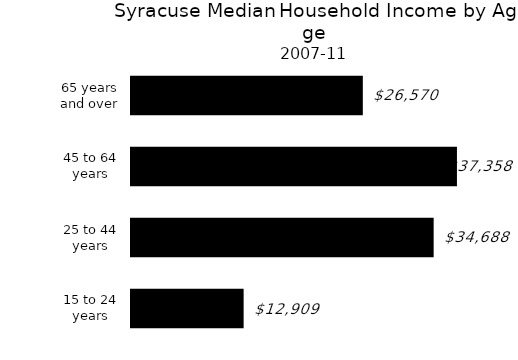
| Category | Series 0 |
|---|---|
| 15 to 24 years | 12909 |
| 25 to 44 years | 34688 |
| 45 to 64 years | 37358 |
| 65 years and over | 26570 |